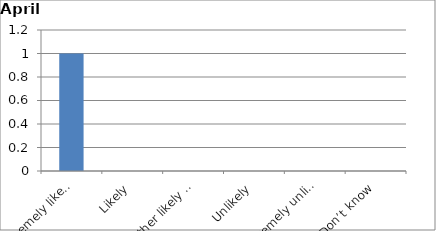
| Category | Series 0 |
|---|---|
| Extremely likely | 1 |
| Likely | 0 |
| Neither likely nor unlikely | 0 |
| Unlikely | 0 |
| Extremely unlikely | 0 |
| Don’t know | 0 |